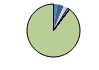
| Category | Series 0 |
|---|---|
| ARRASTRE | 6 |
| CERCO | 8 |
| ATUNEROS CAÑEROS | 2 |
| PALANGRE DE FONDO | 4 |
| PALANGRE DE SUPERFICIE | 3 |
| RASCO | 0 |
| VOLANTA | 3 |
| ARTES FIJAS | 0 |
| ARTES MENORES | 227 |